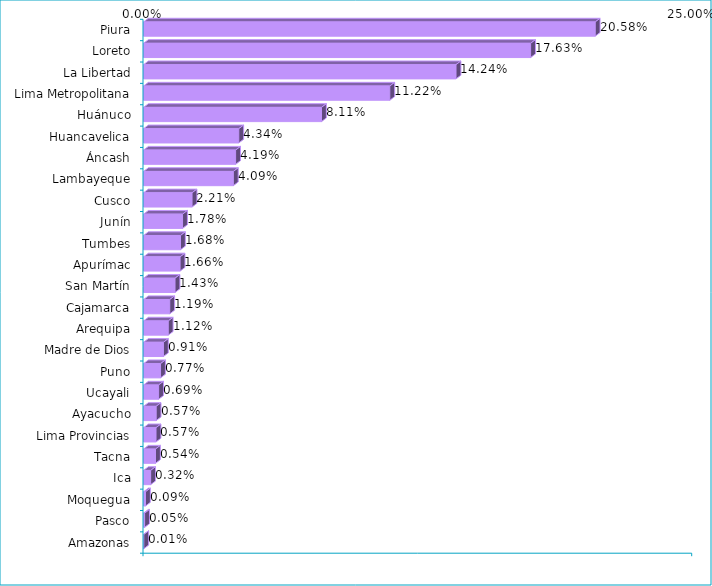
| Category | Series 0 |
|---|---|
| Piura | 0.206 |
| Loreto | 0.176 |
| La Libertad | 0.142 |
| Lima Metropolitana | 0.112 |
| Huánuco | 0.081 |
| Huancavelica | 0.043 |
| Áncash | 0.042 |
| Lambayeque | 0.041 |
| Cusco | 0.022 |
| Junín | 0.018 |
| Tumbes | 0.017 |
| Apurímac | 0.017 |
| San Martín | 0.014 |
| Cajamarca | 0.012 |
| Arequipa | 0.011 |
| Madre de Dios | 0.009 |
| Puno | 0.008 |
| Ucayali | 0.007 |
| Ayacucho | 0.006 |
| Lima Provincias | 0.006 |
| Tacna | 0.005 |
| Ica | 0.003 |
| Moquegua | 0.001 |
| Pasco | 0 |
| Amazonas | 0 |